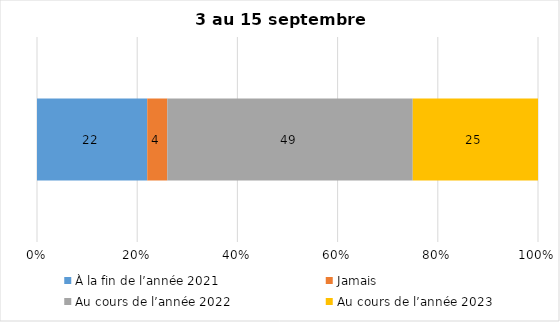
| Category | À la fin de l’année 2021 | Jamais | Au cours de l’année 2022 | Au cours de l’année 2023 |
|---|---|---|---|---|
| 0 | 22 | 4 | 49 | 25 |